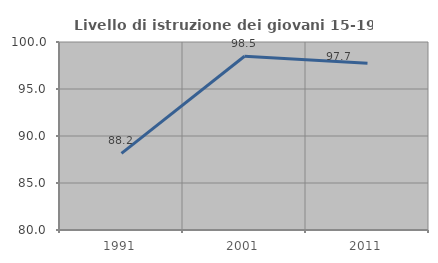
| Category | Livello di istruzione dei giovani 15-19 anni |
|---|---|
| 1991.0 | 88.158 |
| 2001.0 | 98.485 |
| 2011.0 | 97.727 |